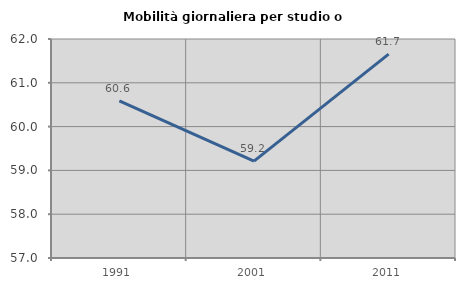
| Category | Mobilità giornaliera per studio o lavoro |
|---|---|
| 1991.0 | 60.588 |
| 2001.0 | 59.211 |
| 2011.0 | 61.654 |